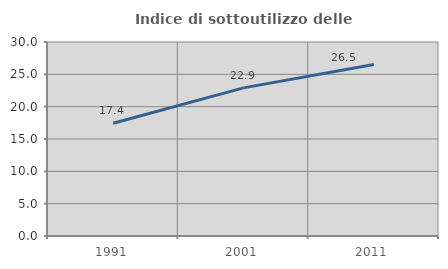
| Category | Indice di sottoutilizzo delle abitazioni  |
|---|---|
| 1991.0 | 17.43 |
| 2001.0 | 22.907 |
| 2011.0 | 26.536 |